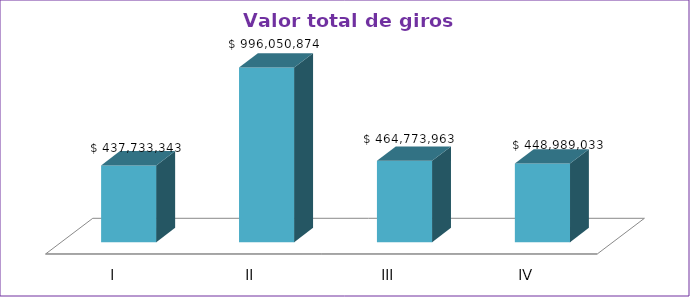
| Category | Series 0 |
|---|---|
| I | 437733343 |
| II | 996050874 |
| III | 464773963 |
| IV | 448989033 |